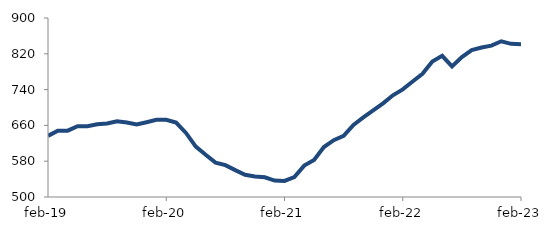
| Category | Series 0 |
|---|---|
| 2019-02-01 | 636.624 |
| 2019-03-01 | 648.17 |
| 2019-04-01 | 648.206 |
| 2019-05-01 | 658.035 |
| 2019-06-01 | 657.952 |
| 2019-07-01 | 662.49 |
| 2019-08-01 | 664.104 |
| 2019-09-01 | 669.196 |
| 2019-10-01 | 666.5 |
| 2019-11-01 | 662.174 |
| 2019-12-01 | 667.143 |
| 2020-01-01 | 672.455 |
| 2020-02-01 | 672.659 |
| 2020-03-01 | 666.213 |
| 2020-04-01 | 643.145 |
| 2020-05-01 | 612.572 |
| 2020-06-01 | 594.292 |
| 2020-07-01 | 576.858 |
| 2020-08-01 | 571.224 |
| 2020-09-01 | 560.032 |
| 2020-10-01 | 549.541 |
| 2020-11-01 | 545.982 |
| 2020-12-01 | 544.038 |
| 2021-01-01 | 536.772 |
| 2021-02-01 | 535.938 |
| 2021-03-01 | 544.717 |
| 2021-04-01 | 570.16 |
| 2021-05-01 | 582.981 |
| 2021-06-01 | 611.684 |
| 2021-07-01 | 627.037 |
| 2021-08-01 | 636.642 |
| 2021-09-01 | 661.114 |
| 2021-10-01 | 677.889 |
| 2021-11-01 | 693.389 |
| 2021-12-01 | 709.343 |
| 2022-01-01 | 727.31 |
| 2022-02-01 | 740.539 |
| 2022-03-01 | 758.027 |
| 2022-04-01 | 775.241 |
| 2022-05-01 | 802.956 |
| 2022-06-01 | 815.434 |
| 2022-07-01 | 791.89 |
| 2022-08-01 | 812.76 |
| 2022-09-01 | 828.12 |
| 2022-10-01 | 834 |
| 2022-11-01 | 838.178 |
| 2022-12-01 | 847.954 |
| 2023-01-01 | 842.285 |
| 2023-02-01 | 841.25 |